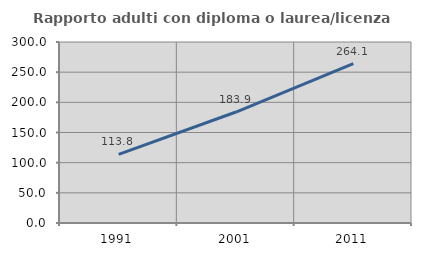
| Category | Rapporto adulti con diploma o laurea/licenza media  |
|---|---|
| 1991.0 | 113.844 |
| 2001.0 | 183.936 |
| 2011.0 | 264.101 |